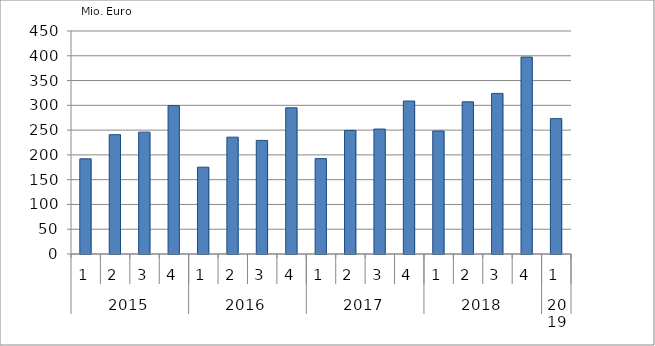
| Category | Ausbaugewerblicher Umsatz3 |
|---|---|
| 0 | 192043.756 |
| 1 | 240826.879 |
| 2 | 245916.087 |
| 3 | 299455.378 |
| 4 | 175225.59 |
| 5 | 235781.631 |
| 6 | 229227.559 |
| 7 | 294992.157 |
| 8 | 192499.539 |
| 9 | 249394.388 |
| 10 | 252146.755 |
| 11 | 308653.153 |
| 12 | 248133.418 |
| 13 | 307099.899 |
| 14 | 324088.989 |
| 15 | 397377.201 |
| 16 | 273159.137 |